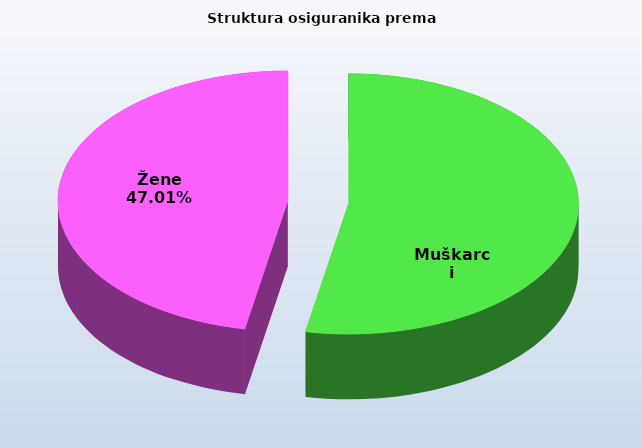
| Category | Series 0 |
|---|---|
| Muškarci | 814034 |
| Žene | 722266 |